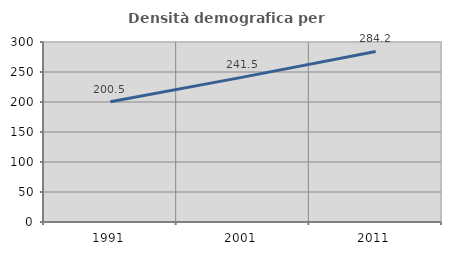
| Category | Densità demografica |
|---|---|
| 1991.0 | 200.514 |
| 2001.0 | 241.482 |
| 2011.0 | 284.181 |